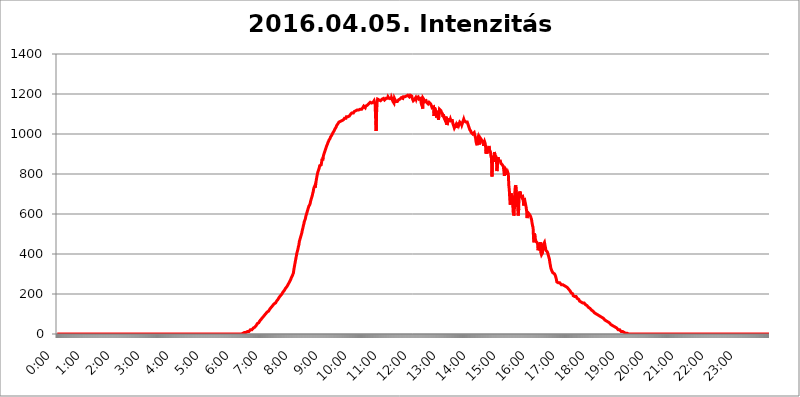
| Category | 2016.04.05. Intenzitás [W/m^2] |
|---|---|
| 0.0 | 0 |
| 0.0006944444444444445 | 0 |
| 0.001388888888888889 | 0 |
| 0.0020833333333333333 | 0 |
| 0.002777777777777778 | 0 |
| 0.003472222222222222 | 0 |
| 0.004166666666666667 | 0 |
| 0.004861111111111111 | 0 |
| 0.005555555555555556 | 0 |
| 0.0062499999999999995 | 0 |
| 0.006944444444444444 | 0 |
| 0.007638888888888889 | 0 |
| 0.008333333333333333 | 0 |
| 0.009027777777777779 | 0 |
| 0.009722222222222222 | 0 |
| 0.010416666666666666 | 0 |
| 0.011111111111111112 | 0 |
| 0.011805555555555555 | 0 |
| 0.012499999999999999 | 0 |
| 0.013194444444444444 | 0 |
| 0.013888888888888888 | 0 |
| 0.014583333333333332 | 0 |
| 0.015277777777777777 | 0 |
| 0.015972222222222224 | 0 |
| 0.016666666666666666 | 0 |
| 0.017361111111111112 | 0 |
| 0.018055555555555557 | 0 |
| 0.01875 | 0 |
| 0.019444444444444445 | 0 |
| 0.02013888888888889 | 0 |
| 0.020833333333333332 | 0 |
| 0.02152777777777778 | 0 |
| 0.022222222222222223 | 0 |
| 0.02291666666666667 | 0 |
| 0.02361111111111111 | 0 |
| 0.024305555555555556 | 0 |
| 0.024999999999999998 | 0 |
| 0.025694444444444447 | 0 |
| 0.02638888888888889 | 0 |
| 0.027083333333333334 | 0 |
| 0.027777777777777776 | 0 |
| 0.02847222222222222 | 0 |
| 0.029166666666666664 | 0 |
| 0.029861111111111113 | 0 |
| 0.030555555555555555 | 0 |
| 0.03125 | 0 |
| 0.03194444444444445 | 0 |
| 0.03263888888888889 | 0 |
| 0.03333333333333333 | 0 |
| 0.034027777777777775 | 0 |
| 0.034722222222222224 | 0 |
| 0.035416666666666666 | 0 |
| 0.036111111111111115 | 0 |
| 0.03680555555555556 | 0 |
| 0.0375 | 0 |
| 0.03819444444444444 | 0 |
| 0.03888888888888889 | 0 |
| 0.03958333333333333 | 0 |
| 0.04027777777777778 | 0 |
| 0.04097222222222222 | 0 |
| 0.041666666666666664 | 0 |
| 0.042361111111111106 | 0 |
| 0.04305555555555556 | 0 |
| 0.043750000000000004 | 0 |
| 0.044444444444444446 | 0 |
| 0.04513888888888889 | 0 |
| 0.04583333333333334 | 0 |
| 0.04652777777777778 | 0 |
| 0.04722222222222222 | 0 |
| 0.04791666666666666 | 0 |
| 0.04861111111111111 | 0 |
| 0.049305555555555554 | 0 |
| 0.049999999999999996 | 0 |
| 0.05069444444444445 | 0 |
| 0.051388888888888894 | 0 |
| 0.052083333333333336 | 0 |
| 0.05277777777777778 | 0 |
| 0.05347222222222222 | 0 |
| 0.05416666666666667 | 0 |
| 0.05486111111111111 | 0 |
| 0.05555555555555555 | 0 |
| 0.05625 | 0 |
| 0.05694444444444444 | 0 |
| 0.057638888888888885 | 0 |
| 0.05833333333333333 | 0 |
| 0.05902777777777778 | 0 |
| 0.059722222222222225 | 0 |
| 0.06041666666666667 | 0 |
| 0.061111111111111116 | 0 |
| 0.06180555555555556 | 0 |
| 0.0625 | 0 |
| 0.06319444444444444 | 0 |
| 0.06388888888888888 | 0 |
| 0.06458333333333334 | 0 |
| 0.06527777777777778 | 0 |
| 0.06597222222222222 | 0 |
| 0.06666666666666667 | 0 |
| 0.06736111111111111 | 0 |
| 0.06805555555555555 | 0 |
| 0.06874999999999999 | 0 |
| 0.06944444444444443 | 0 |
| 0.07013888888888889 | 0 |
| 0.07083333333333333 | 0 |
| 0.07152777777777779 | 0 |
| 0.07222222222222223 | 0 |
| 0.07291666666666667 | 0 |
| 0.07361111111111111 | 0 |
| 0.07430555555555556 | 0 |
| 0.075 | 0 |
| 0.07569444444444444 | 0 |
| 0.0763888888888889 | 0 |
| 0.07708333333333334 | 0 |
| 0.07777777777777778 | 0 |
| 0.07847222222222222 | 0 |
| 0.07916666666666666 | 0 |
| 0.0798611111111111 | 0 |
| 0.08055555555555556 | 0 |
| 0.08125 | 0 |
| 0.08194444444444444 | 0 |
| 0.08263888888888889 | 0 |
| 0.08333333333333333 | 0 |
| 0.08402777777777777 | 0 |
| 0.08472222222222221 | 0 |
| 0.08541666666666665 | 0 |
| 0.08611111111111112 | 0 |
| 0.08680555555555557 | 0 |
| 0.08750000000000001 | 0 |
| 0.08819444444444445 | 0 |
| 0.08888888888888889 | 0 |
| 0.08958333333333333 | 0 |
| 0.09027777777777778 | 0 |
| 0.09097222222222222 | 0 |
| 0.09166666666666667 | 0 |
| 0.09236111111111112 | 0 |
| 0.09305555555555556 | 0 |
| 0.09375 | 0 |
| 0.09444444444444444 | 0 |
| 0.09513888888888888 | 0 |
| 0.09583333333333333 | 0 |
| 0.09652777777777777 | 0 |
| 0.09722222222222222 | 0 |
| 0.09791666666666667 | 0 |
| 0.09861111111111111 | 0 |
| 0.09930555555555555 | 0 |
| 0.09999999999999999 | 0 |
| 0.10069444444444443 | 0 |
| 0.1013888888888889 | 0 |
| 0.10208333333333335 | 0 |
| 0.10277777777777779 | 0 |
| 0.10347222222222223 | 0 |
| 0.10416666666666667 | 0 |
| 0.10486111111111111 | 0 |
| 0.10555555555555556 | 0 |
| 0.10625 | 0 |
| 0.10694444444444444 | 0 |
| 0.1076388888888889 | 0 |
| 0.10833333333333334 | 0 |
| 0.10902777777777778 | 0 |
| 0.10972222222222222 | 0 |
| 0.1111111111111111 | 0 |
| 0.11180555555555556 | 0 |
| 0.11180555555555556 | 0 |
| 0.1125 | 0 |
| 0.11319444444444444 | 0 |
| 0.11388888888888889 | 0 |
| 0.11458333333333333 | 0 |
| 0.11527777777777777 | 0 |
| 0.11597222222222221 | 0 |
| 0.11666666666666665 | 0 |
| 0.1173611111111111 | 0 |
| 0.11805555555555557 | 0 |
| 0.11944444444444445 | 0 |
| 0.12013888888888889 | 0 |
| 0.12083333333333333 | 0 |
| 0.12152777777777778 | 0 |
| 0.12222222222222223 | 0 |
| 0.12291666666666667 | 0 |
| 0.12291666666666667 | 0 |
| 0.12361111111111112 | 0 |
| 0.12430555555555556 | 0 |
| 0.125 | 0 |
| 0.12569444444444444 | 0 |
| 0.12638888888888888 | 0 |
| 0.12708333333333333 | 0 |
| 0.16875 | 0 |
| 0.12847222222222224 | 0 |
| 0.12916666666666668 | 0 |
| 0.12986111111111112 | 0 |
| 0.13055555555555556 | 0 |
| 0.13125 | 0 |
| 0.13194444444444445 | 0 |
| 0.1326388888888889 | 0 |
| 0.13333333333333333 | 0 |
| 0.13402777777777777 | 0 |
| 0.13402777777777777 | 0 |
| 0.13472222222222222 | 0 |
| 0.13541666666666666 | 0 |
| 0.1361111111111111 | 0 |
| 0.13749999999999998 | 0 |
| 0.13819444444444443 | 0 |
| 0.1388888888888889 | 0 |
| 0.13958333333333334 | 0 |
| 0.14027777777777778 | 0 |
| 0.14097222222222222 | 0 |
| 0.14166666666666666 | 0 |
| 0.1423611111111111 | 0 |
| 0.14305555555555557 | 0 |
| 0.14375000000000002 | 0 |
| 0.14444444444444446 | 0 |
| 0.1451388888888889 | 0 |
| 0.1451388888888889 | 0 |
| 0.14652777777777778 | 0 |
| 0.14722222222222223 | 0 |
| 0.14791666666666667 | 0 |
| 0.1486111111111111 | 0 |
| 0.14930555555555555 | 0 |
| 0.15 | 0 |
| 0.15069444444444444 | 0 |
| 0.15138888888888888 | 0 |
| 0.15208333333333332 | 0 |
| 0.15277777777777776 | 0 |
| 0.15347222222222223 | 0 |
| 0.15416666666666667 | 0 |
| 0.15486111111111112 | 0 |
| 0.15555555555555556 | 0 |
| 0.15625 | 0 |
| 0.15694444444444444 | 0 |
| 0.15763888888888888 | 0 |
| 0.15833333333333333 | 0 |
| 0.15902777777777777 | 0 |
| 0.15972222222222224 | 0 |
| 0.16041666666666668 | 0 |
| 0.16111111111111112 | 0 |
| 0.16180555555555556 | 0 |
| 0.1625 | 0 |
| 0.16319444444444445 | 0 |
| 0.1638888888888889 | 0 |
| 0.16458333333333333 | 0 |
| 0.16527777777777777 | 0 |
| 0.16597222222222222 | 0 |
| 0.16666666666666666 | 0 |
| 0.1673611111111111 | 0 |
| 0.16805555555555554 | 0 |
| 0.16874999999999998 | 0 |
| 0.16944444444444443 | 0 |
| 0.17013888888888887 | 0 |
| 0.1708333333333333 | 0 |
| 0.17152777777777775 | 0 |
| 0.17222222222222225 | 0 |
| 0.1729166666666667 | 0 |
| 0.17361111111111113 | 0 |
| 0.17430555555555557 | 0 |
| 0.17500000000000002 | 0 |
| 0.17569444444444446 | 0 |
| 0.1763888888888889 | 0 |
| 0.17708333333333334 | 0 |
| 0.17777777777777778 | 0 |
| 0.17847222222222223 | 0 |
| 0.17916666666666667 | 0 |
| 0.1798611111111111 | 0 |
| 0.18055555555555555 | 0 |
| 0.18125 | 0 |
| 0.18194444444444444 | 0 |
| 0.1826388888888889 | 0 |
| 0.18333333333333335 | 0 |
| 0.1840277777777778 | 0 |
| 0.18472222222222223 | 0 |
| 0.18541666666666667 | 0 |
| 0.18611111111111112 | 0 |
| 0.18680555555555556 | 0 |
| 0.1875 | 0 |
| 0.18819444444444444 | 0 |
| 0.18888888888888888 | 0 |
| 0.18958333333333333 | 0 |
| 0.19027777777777777 | 0 |
| 0.1909722222222222 | 0 |
| 0.19166666666666665 | 0 |
| 0.19236111111111112 | 0 |
| 0.19305555555555554 | 0 |
| 0.19375 | 0 |
| 0.19444444444444445 | 0 |
| 0.1951388888888889 | 0 |
| 0.19583333333333333 | 0 |
| 0.19652777777777777 | 0 |
| 0.19722222222222222 | 0 |
| 0.19791666666666666 | 0 |
| 0.1986111111111111 | 0 |
| 0.19930555555555554 | 0 |
| 0.19999999999999998 | 0 |
| 0.20069444444444443 | 0 |
| 0.20138888888888887 | 0 |
| 0.2020833333333333 | 0 |
| 0.2027777777777778 | 0 |
| 0.2034722222222222 | 0 |
| 0.2041666666666667 | 0 |
| 0.20486111111111113 | 0 |
| 0.20555555555555557 | 0 |
| 0.20625000000000002 | 0 |
| 0.20694444444444446 | 0 |
| 0.2076388888888889 | 0 |
| 0.20833333333333334 | 0 |
| 0.20902777777777778 | 0 |
| 0.20972222222222223 | 0 |
| 0.21041666666666667 | 0 |
| 0.2111111111111111 | 0 |
| 0.21180555555555555 | 0 |
| 0.2125 | 0 |
| 0.21319444444444444 | 0 |
| 0.2138888888888889 | 0 |
| 0.21458333333333335 | 0 |
| 0.2152777777777778 | 0 |
| 0.21597222222222223 | 0 |
| 0.21666666666666667 | 0 |
| 0.21736111111111112 | 0 |
| 0.21805555555555556 | 0 |
| 0.21875 | 0 |
| 0.21944444444444444 | 0 |
| 0.22013888888888888 | 0 |
| 0.22083333333333333 | 0 |
| 0.22152777777777777 | 0 |
| 0.2222222222222222 | 0 |
| 0.22291666666666665 | 0 |
| 0.2236111111111111 | 0 |
| 0.22430555555555556 | 0 |
| 0.225 | 0 |
| 0.22569444444444445 | 0 |
| 0.2263888888888889 | 0 |
| 0.22708333333333333 | 0 |
| 0.22777777777777777 | 0 |
| 0.22847222222222222 | 0 |
| 0.22916666666666666 | 0 |
| 0.2298611111111111 | 0 |
| 0.23055555555555554 | 0 |
| 0.23124999999999998 | 0 |
| 0.23194444444444443 | 0 |
| 0.23263888888888887 | 0 |
| 0.2333333333333333 | 0 |
| 0.2340277777777778 | 0 |
| 0.2347222222222222 | 0 |
| 0.2354166666666667 | 0 |
| 0.23611111111111113 | 0 |
| 0.23680555555555557 | 0 |
| 0.23750000000000002 | 0 |
| 0.23819444444444446 | 0 |
| 0.2388888888888889 | 0 |
| 0.23958333333333334 | 0 |
| 0.24027777777777778 | 0 |
| 0.24097222222222223 | 0 |
| 0.24166666666666667 | 0 |
| 0.2423611111111111 | 0 |
| 0.24305555555555555 | 0 |
| 0.24375 | 0 |
| 0.24444444444444446 | 0 |
| 0.24513888888888888 | 0 |
| 0.24583333333333335 | 0 |
| 0.2465277777777778 | 0 |
| 0.24722222222222223 | 0 |
| 0.24791666666666667 | 0 |
| 0.24861111111111112 | 0 |
| 0.24930555555555556 | 0 |
| 0.25 | 0 |
| 0.25069444444444444 | 0 |
| 0.2513888888888889 | 0 |
| 0.2520833333333333 | 0 |
| 0.25277777777777777 | 0 |
| 0.2534722222222222 | 0 |
| 0.25416666666666665 | 0 |
| 0.2548611111111111 | 0 |
| 0.2555555555555556 | 0 |
| 0.25625000000000003 | 0 |
| 0.2569444444444445 | 0 |
| 0.2576388888888889 | 0 |
| 0.25833333333333336 | 0 |
| 0.2590277777777778 | 3.525 |
| 0.25972222222222224 | 3.525 |
| 0.2604166666666667 | 3.525 |
| 0.2611111111111111 | 3.525 |
| 0.26180555555555557 | 3.525 |
| 0.2625 | 7.887 |
| 0.26319444444444445 | 7.887 |
| 0.2638888888888889 | 7.887 |
| 0.26458333333333334 | 7.887 |
| 0.2652777777777778 | 7.887 |
| 0.2659722222222222 | 12.257 |
| 0.26666666666666666 | 12.257 |
| 0.2673611111111111 | 12.257 |
| 0.26805555555555555 | 12.257 |
| 0.26875 | 12.257 |
| 0.26944444444444443 | 16.636 |
| 0.2701388888888889 | 16.636 |
| 0.2708333333333333 | 21.024 |
| 0.27152777777777776 | 21.024 |
| 0.2722222222222222 | 21.024 |
| 0.27291666666666664 | 21.024 |
| 0.2736111111111111 | 25.419 |
| 0.2743055555555555 | 25.419 |
| 0.27499999999999997 | 29.823 |
| 0.27569444444444446 | 29.823 |
| 0.27638888888888885 | 34.234 |
| 0.27708333333333335 | 34.234 |
| 0.2777777777777778 | 38.653 |
| 0.27847222222222223 | 38.653 |
| 0.2791666666666667 | 43.079 |
| 0.2798611111111111 | 47.511 |
| 0.28055555555555556 | 51.951 |
| 0.28125 | 56.398 |
| 0.28194444444444444 | 56.398 |
| 0.2826388888888889 | 56.398 |
| 0.2833333333333333 | 60.85 |
| 0.28402777777777777 | 65.31 |
| 0.2847222222222222 | 65.31 |
| 0.28541666666666665 | 69.775 |
| 0.28611111111111115 | 74.246 |
| 0.28680555555555554 | 74.246 |
| 0.28750000000000003 | 78.722 |
| 0.2881944444444445 | 83.205 |
| 0.2888888888888889 | 83.205 |
| 0.28958333333333336 | 87.692 |
| 0.2902777777777778 | 92.184 |
| 0.29097222222222224 | 92.184 |
| 0.2916666666666667 | 96.682 |
| 0.2923611111111111 | 101.184 |
| 0.29305555555555557 | 101.184 |
| 0.29375 | 105.69 |
| 0.29444444444444445 | 110.201 |
| 0.2951388888888889 | 110.201 |
| 0.29583333333333334 | 114.716 |
| 0.2965277777777778 | 114.716 |
| 0.2972222222222222 | 119.235 |
| 0.29791666666666666 | 123.758 |
| 0.2986111111111111 | 128.284 |
| 0.29930555555555555 | 128.284 |
| 0.3 | 132.814 |
| 0.30069444444444443 | 137.347 |
| 0.3013888888888889 | 137.347 |
| 0.3020833333333333 | 141.884 |
| 0.30277777777777776 | 141.884 |
| 0.3034722222222222 | 146.423 |
| 0.30416666666666664 | 150.964 |
| 0.3048611111111111 | 155.509 |
| 0.3055555555555555 | 155.509 |
| 0.30624999999999997 | 155.509 |
| 0.3069444444444444 | 160.056 |
| 0.3076388888888889 | 164.605 |
| 0.30833333333333335 | 164.605 |
| 0.3090277777777778 | 169.156 |
| 0.30972222222222223 | 173.709 |
| 0.3104166666666667 | 178.264 |
| 0.3111111111111111 | 182.82 |
| 0.31180555555555556 | 182.82 |
| 0.3125 | 187.378 |
| 0.31319444444444444 | 191.937 |
| 0.3138888888888889 | 196.497 |
| 0.3145833333333333 | 196.497 |
| 0.31527777777777777 | 201.058 |
| 0.3159722222222222 | 205.62 |
| 0.31666666666666665 | 210.182 |
| 0.31736111111111115 | 210.182 |
| 0.31805555555555554 | 214.746 |
| 0.31875000000000003 | 219.309 |
| 0.3194444444444445 | 223.873 |
| 0.3201388888888889 | 228.436 |
| 0.32083333333333336 | 233 |
| 0.3215277777777778 | 233 |
| 0.32222222222222224 | 237.564 |
| 0.3229166666666667 | 242.127 |
| 0.3236111111111111 | 246.689 |
| 0.32430555555555557 | 251.251 |
| 0.325 | 251.251 |
| 0.32569444444444445 | 260.373 |
| 0.3263888888888889 | 260.373 |
| 0.32708333333333334 | 269.49 |
| 0.3277777777777778 | 274.047 |
| 0.3284722222222222 | 283.156 |
| 0.32916666666666666 | 287.709 |
| 0.3298611111111111 | 292.259 |
| 0.33055555555555555 | 296.808 |
| 0.33125 | 305.898 |
| 0.33194444444444443 | 324.052 |
| 0.3326388888888889 | 337.639 |
| 0.3333333333333333 | 351.198 |
| 0.3340277777777778 | 364.728 |
| 0.3347222222222222 | 378.224 |
| 0.3354166666666667 | 391.685 |
| 0.3361111111111111 | 405.108 |
| 0.3368055555555556 | 414.035 |
| 0.33749999999999997 | 422.943 |
| 0.33819444444444446 | 436.27 |
| 0.33888888888888885 | 445.129 |
| 0.33958333333333335 | 462.786 |
| 0.34027777777777773 | 471.582 |
| 0.34097222222222223 | 480.356 |
| 0.3416666666666666 | 489.108 |
| 0.3423611111111111 | 497.836 |
| 0.3430555555555555 | 506.542 |
| 0.34375 | 519.555 |
| 0.3444444444444445 | 528.2 |
| 0.3451388888888889 | 541.121 |
| 0.3458333333333334 | 549.704 |
| 0.34652777777777777 | 562.53 |
| 0.34722222222222227 | 566.793 |
| 0.34791666666666665 | 575.299 |
| 0.34861111111111115 | 588.009 |
| 0.34930555555555554 | 596.45 |
| 0.35000000000000003 | 604.864 |
| 0.3506944444444444 | 613.252 |
| 0.3513888888888889 | 621.613 |
| 0.3520833333333333 | 629.948 |
| 0.3527777777777778 | 638.256 |
| 0.3534722222222222 | 638.256 |
| 0.3541666666666667 | 646.537 |
| 0.3548611111111111 | 654.791 |
| 0.35555555555555557 | 667.123 |
| 0.35625 | 675.311 |
| 0.35694444444444445 | 683.473 |
| 0.3576388888888889 | 691.608 |
| 0.35833333333333334 | 703.762 |
| 0.3590277777777778 | 711.832 |
| 0.3597222222222222 | 727.896 |
| 0.36041666666666666 | 731.896 |
| 0.3611111111111111 | 739.877 |
| 0.36180555555555555 | 731.896 |
| 0.3625 | 747.834 |
| 0.36319444444444443 | 767.62 |
| 0.3638888888888889 | 767.62 |
| 0.3645833333333333 | 795.074 |
| 0.3652777777777778 | 806.757 |
| 0.3659722222222222 | 814.519 |
| 0.3666666666666667 | 822.26 |
| 0.3673611111111111 | 829.981 |
| 0.3680555555555556 | 841.526 |
| 0.36874999999999997 | 837.682 |
| 0.36944444444444446 | 841.526 |
| 0.37013888888888885 | 845.365 |
| 0.37083333333333335 | 860.676 |
| 0.37152777777777773 | 875.918 |
| 0.37222222222222223 | 868.305 |
| 0.3729166666666666 | 883.516 |
| 0.3736111111111111 | 894.885 |
| 0.3743055555555555 | 902.447 |
| 0.375 | 909.996 |
| 0.3756944444444445 | 917.534 |
| 0.3763888888888889 | 925.06 |
| 0.3770833333333334 | 932.576 |
| 0.37777777777777777 | 940.082 |
| 0.37847222222222227 | 943.832 |
| 0.37916666666666665 | 951.327 |
| 0.37986111111111115 | 958.814 |
| 0.38055555555555554 | 962.555 |
| 0.38125000000000003 | 970.034 |
| 0.3819444444444444 | 973.772 |
| 0.3826388888888889 | 977.508 |
| 0.3833333333333333 | 984.98 |
| 0.3840277777777778 | 988.714 |
| 0.3847222222222222 | 992.448 |
| 0.3854166666666667 | 996.182 |
| 0.3861111111111111 | 996.182 |
| 0.38680555555555557 | 1007.383 |
| 0.3875 | 1007.383 |
| 0.38819444444444445 | 1014.852 |
| 0.3888888888888889 | 1018.587 |
| 0.38958333333333334 | 1026.06 |
| 0.3902777777777778 | 1029.798 |
| 0.3909722222222222 | 1033.537 |
| 0.39166666666666666 | 1041.019 |
| 0.3923611111111111 | 1041.019 |
| 0.39305555555555555 | 1041.019 |
| 0.39375 | 1052.255 |
| 0.39444444444444443 | 1056.004 |
| 0.3951388888888889 | 1059.756 |
| 0.3958333333333333 | 1059.756 |
| 0.3965277777777778 | 1063.51 |
| 0.3972222222222222 | 1063.51 |
| 0.3979166666666667 | 1063.51 |
| 0.3986111111111111 | 1067.267 |
| 0.3993055555555556 | 1067.267 |
| 0.39999999999999997 | 1067.267 |
| 0.40069444444444446 | 1071.027 |
| 0.40138888888888885 | 1071.027 |
| 0.40208333333333335 | 1074.789 |
| 0.40277777777777773 | 1078.555 |
| 0.40347222222222223 | 1078.555 |
| 0.4041666666666666 | 1078.555 |
| 0.4048611111111111 | 1078.555 |
| 0.4055555555555555 | 1086.097 |
| 0.40625 | 1086.097 |
| 0.4069444444444445 | 1086.097 |
| 0.4076388888888889 | 1086.097 |
| 0.4083333333333334 | 1089.873 |
| 0.40902777777777777 | 1089.873 |
| 0.40972222222222227 | 1089.873 |
| 0.41041666666666665 | 1093.653 |
| 0.41111111111111115 | 1097.437 |
| 0.41180555555555554 | 1101.226 |
| 0.41250000000000003 | 1101.226 |
| 0.4131944444444444 | 1105.019 |
| 0.4138888888888889 | 1101.226 |
| 0.4145833333333333 | 1105.019 |
| 0.4152777777777778 | 1105.019 |
| 0.4159722222222222 | 1108.816 |
| 0.4166666666666667 | 1112.618 |
| 0.4173611111111111 | 1112.618 |
| 0.41805555555555557 | 1116.426 |
| 0.41875 | 1116.426 |
| 0.41944444444444445 | 1120.238 |
| 0.4201388888888889 | 1120.238 |
| 0.42083333333333334 | 1120.238 |
| 0.4215277777777778 | 1120.238 |
| 0.4222222222222222 | 1120.238 |
| 0.42291666666666666 | 1120.238 |
| 0.4236111111111111 | 1120.238 |
| 0.42430555555555555 | 1124.056 |
| 0.425 | 1124.056 |
| 0.42569444444444443 | 1124.056 |
| 0.4263888888888889 | 1120.238 |
| 0.4270833333333333 | 1124.056 |
| 0.4277777777777778 | 1127.879 |
| 0.4284722222222222 | 1131.708 |
| 0.4291666666666667 | 1131.708 |
| 0.4298611111111111 | 1139.384 |
| 0.4305555555555556 | 1139.384 |
| 0.43124999999999997 | 1143.232 |
| 0.43194444444444446 | 1131.708 |
| 0.43263888888888885 | 1139.384 |
| 0.43333333333333335 | 1135.543 |
| 0.43402777777777773 | 1139.384 |
| 0.43472222222222223 | 1143.232 |
| 0.4354166666666666 | 1143.232 |
| 0.4361111111111111 | 1143.232 |
| 0.4368055555555555 | 1150.946 |
| 0.4375 | 1150.946 |
| 0.4381944444444445 | 1150.946 |
| 0.4388888888888889 | 1158.689 |
| 0.4395833333333334 | 1154.814 |
| 0.44027777777777777 | 1158.689 |
| 0.44097222222222227 | 1154.814 |
| 0.44166666666666665 | 1154.814 |
| 0.44236111111111115 | 1154.814 |
| 0.44305555555555554 | 1158.689 |
| 0.44375000000000003 | 1162.571 |
| 0.4444444444444444 | 1166.46 |
| 0.4451388888888889 | 1162.571 |
| 0.4458333333333333 | 1147.086 |
| 0.4465277777777778 | 1078.555 |
| 0.4472222222222222 | 1014.852 |
| 0.4479166666666667 | 1108.816 |
| 0.4486111111111111 | 1158.689 |
| 0.44930555555555557 | 1174.263 |
| 0.45 | 1170.358 |
| 0.45069444444444445 | 1170.358 |
| 0.4513888888888889 | 1170.358 |
| 0.45208333333333334 | 1166.46 |
| 0.4527777777777778 | 1166.46 |
| 0.4534722222222222 | 1166.46 |
| 0.45416666666666666 | 1170.358 |
| 0.4548611111111111 | 1170.358 |
| 0.45555555555555555 | 1174.263 |
| 0.45625 | 1174.263 |
| 0.45694444444444443 | 1174.263 |
| 0.4576388888888889 | 1178.177 |
| 0.4583333333333333 | 1174.263 |
| 0.4590277777777778 | 1170.358 |
| 0.4597222222222222 | 1174.263 |
| 0.4604166666666667 | 1166.46 |
| 0.4611111111111111 | 1178.177 |
| 0.4618055555555556 | 1178.177 |
| 0.46249999999999997 | 1182.099 |
| 0.46319444444444446 | 1178.177 |
| 0.46388888888888885 | 1186.03 |
| 0.46458333333333335 | 1182.099 |
| 0.46527777777777773 | 1178.177 |
| 0.46597222222222223 | 1178.177 |
| 0.4666666666666666 | 1178.177 |
| 0.4673611111111111 | 1178.177 |
| 0.4680555555555555 | 1170.358 |
| 0.46875 | 1182.099 |
| 0.4694444444444445 | 1186.03 |
| 0.4701388888888889 | 1182.099 |
| 0.4708333333333334 | 1162.571 |
| 0.47152777777777777 | 1158.689 |
| 0.47222222222222227 | 1154.814 |
| 0.47291666666666665 | 1178.177 |
| 0.47361111111111115 | 1178.177 |
| 0.47430555555555554 | 1174.263 |
| 0.47500000000000003 | 1162.571 |
| 0.4756944444444444 | 1158.689 |
| 0.4763888888888889 | 1162.571 |
| 0.4770833333333333 | 1162.571 |
| 0.4777777777777778 | 1166.46 |
| 0.4784722222222222 | 1170.358 |
| 0.4791666666666667 | 1174.263 |
| 0.4798611111111111 | 1174.263 |
| 0.48055555555555557 | 1174.263 |
| 0.48125 | 1170.358 |
| 0.48194444444444445 | 1174.263 |
| 0.4826388888888889 | 1182.099 |
| 0.48333333333333334 | 1178.177 |
| 0.4840277777777778 | 1178.177 |
| 0.4847222222222222 | 1178.177 |
| 0.48541666666666666 | 1186.03 |
| 0.4861111111111111 | 1189.969 |
| 0.48680555555555555 | 1186.03 |
| 0.4875 | 1186.03 |
| 0.48819444444444443 | 1186.03 |
| 0.4888888888888889 | 1186.03 |
| 0.4895833333333333 | 1189.969 |
| 0.4902777777777778 | 1193.918 |
| 0.4909722222222222 | 1189.969 |
| 0.4916666666666667 | 1193.918 |
| 0.4923611111111111 | 1193.918 |
| 0.4930555555555556 | 1189.969 |
| 0.49374999999999997 | 1186.03 |
| 0.49444444444444446 | 1189.969 |
| 0.49513888888888885 | 1193.918 |
| 0.49583333333333335 | 1189.969 |
| 0.49652777777777773 | 1189.969 |
| 0.49722222222222223 | 1189.969 |
| 0.4979166666666666 | 1178.177 |
| 0.4986111111111111 | 1178.177 |
| 0.4993055555555555 | 1166.46 |
| 0.5 | 1166.46 |
| 0.5006944444444444 | 1170.358 |
| 0.5013888888888889 | 1174.263 |
| 0.5020833333333333 | 1178.177 |
| 0.5027777777777778 | 1182.099 |
| 0.5034722222222222 | 1174.263 |
| 0.5041666666666667 | 1182.099 |
| 0.5048611111111111 | 1178.177 |
| 0.5055555555555555 | 1182.099 |
| 0.50625 | 1186.03 |
| 0.5069444444444444 | 1182.099 |
| 0.5076388888888889 | 1174.263 |
| 0.5083333333333333 | 1170.358 |
| 0.5090277777777777 | 1174.263 |
| 0.5097222222222222 | 1178.177 |
| 0.5104166666666666 | 1154.814 |
| 0.5111111111111112 | 1147.086 |
| 0.5118055555555555 | 1154.814 |
| 0.5125000000000001 | 1127.879 |
| 0.5131944444444444 | 1178.177 |
| 0.513888888888889 | 1174.263 |
| 0.5145833333333333 | 1170.358 |
| 0.5152777777777778 | 1162.571 |
| 0.5159722222222222 | 1162.571 |
| 0.5166666666666667 | 1166.46 |
| 0.517361111111111 | 1166.46 |
| 0.5180555555555556 | 1158.689 |
| 0.5187499999999999 | 1158.689 |
| 0.5194444444444445 | 1162.571 |
| 0.5201388888888888 | 1150.946 |
| 0.5208333333333334 | 1154.814 |
| 0.5215277777777778 | 1158.689 |
| 0.5222222222222223 | 1158.689 |
| 0.5229166666666667 | 1158.689 |
| 0.5236111111111111 | 1150.946 |
| 0.5243055555555556 | 1147.086 |
| 0.525 | 1139.384 |
| 0.5256944444444445 | 1131.708 |
| 0.5263888888888889 | 1131.708 |
| 0.5270833333333333 | 1127.879 |
| 0.5277777777777778 | 1135.543 |
| 0.5284722222222222 | 1089.873 |
| 0.5291666666666667 | 1131.708 |
| 0.5298611111111111 | 1135.543 |
| 0.5305555555555556 | 1120.238 |
| 0.53125 | 1105.019 |
| 0.5319444444444444 | 1082.324 |
| 0.5326388888888889 | 1105.019 |
| 0.5333333333333333 | 1116.426 |
| 0.5340277777777778 | 1089.873 |
| 0.5347222222222222 | 1071.027 |
| 0.5354166666666667 | 1101.226 |
| 0.5361111111111111 | 1124.056 |
| 0.5368055555555555 | 1124.056 |
| 0.5375 | 1120.238 |
| 0.5381944444444444 | 1116.426 |
| 0.5388888888888889 | 1108.816 |
| 0.5395833333333333 | 1105.019 |
| 0.5402777777777777 | 1101.226 |
| 0.5409722222222222 | 1086.097 |
| 0.5416666666666666 | 1097.437 |
| 0.5423611111111112 | 1082.324 |
| 0.5430555555555555 | 1082.324 |
| 0.5437500000000001 | 1071.027 |
| 0.5444444444444444 | 1086.097 |
| 0.545138888888889 | 1063.51 |
| 0.5458333333333333 | 1086.097 |
| 0.5465277777777778 | 1044.762 |
| 0.5472222222222222 | 1044.762 |
| 0.5479166666666667 | 1044.762 |
| 0.548611111111111 | 1071.027 |
| 0.5493055555555556 | 1078.555 |
| 0.5499999999999999 | 1059.756 |
| 0.5506944444444445 | 1056.004 |
| 0.5513888888888888 | 1074.789 |
| 0.5520833333333334 | 1067.267 |
| 0.5527777777777778 | 1067.267 |
| 0.5534722222222223 | 1067.267 |
| 0.5541666666666667 | 1067.267 |
| 0.5548611111111111 | 1052.255 |
| 0.5555555555555556 | 1044.762 |
| 0.55625 | 1037.277 |
| 0.5569444444444445 | 1029.798 |
| 0.5576388888888889 | 1029.798 |
| 0.5583333333333333 | 1029.798 |
| 0.5590277777777778 | 1044.762 |
| 0.5597222222222222 | 1029.798 |
| 0.5604166666666667 | 1048.508 |
| 0.5611111111111111 | 1052.255 |
| 0.5618055555555556 | 1052.255 |
| 0.5625 | 1052.255 |
| 0.5631944444444444 | 1044.762 |
| 0.5638888888888889 | 1052.255 |
| 0.5645833333333333 | 1059.756 |
| 0.5652777777777778 | 1059.756 |
| 0.5659722222222222 | 1063.51 |
| 0.5666666666666667 | 1052.255 |
| 0.5673611111111111 | 1044.762 |
| 0.5680555555555555 | 1052.255 |
| 0.56875 | 1059.756 |
| 0.5694444444444444 | 1063.51 |
| 0.5701388888888889 | 1074.789 |
| 0.5708333333333333 | 1067.267 |
| 0.5715277777777777 | 1067.267 |
| 0.5722222222222222 | 1067.267 |
| 0.5729166666666666 | 1059.756 |
| 0.5736111111111112 | 1059.756 |
| 0.5743055555555555 | 1056.004 |
| 0.5750000000000001 | 1059.756 |
| 0.5756944444444444 | 1052.255 |
| 0.576388888888889 | 1044.762 |
| 0.5770833333333333 | 1037.277 |
| 0.5777777777777778 | 1029.798 |
| 0.5784722222222222 | 1022.323 |
| 0.5791666666666667 | 1018.587 |
| 0.579861111111111 | 1014.852 |
| 0.5805555555555556 | 1007.383 |
| 0.5812499999999999 | 1007.383 |
| 0.5819444444444445 | 1003.65 |
| 0.5826388888888888 | 999.916 |
| 0.5833333333333334 | 1003.65 |
| 0.5840277777777778 | 1003.65 |
| 0.5847222222222223 | 1007.383 |
| 0.5854166666666667 | 996.182 |
| 0.5861111111111111 | 988.714 |
| 0.5868055555555556 | 977.508 |
| 0.5875 | 958.814 |
| 0.5881944444444445 | 955.071 |
| 0.5888888888888889 | 943.832 |
| 0.5895833333333333 | 977.508 |
| 0.5902777777777778 | 984.98 |
| 0.5909722222222222 | 973.772 |
| 0.5916666666666667 | 973.772 |
| 0.5923611111111111 | 947.58 |
| 0.5930555555555556 | 981.244 |
| 0.59375 | 977.508 |
| 0.5944444444444444 | 977.508 |
| 0.5951388888888889 | 970.034 |
| 0.5958333333333333 | 966.295 |
| 0.5965277777777778 | 962.555 |
| 0.5972222222222222 | 970.034 |
| 0.5979166666666667 | 940.082 |
| 0.5986111111111111 | 955.071 |
| 0.5993055555555555 | 962.555 |
| 0.6 | 955.071 |
| 0.6006944444444444 | 940.082 |
| 0.6013888888888889 | 902.447 |
| 0.6020833333333333 | 928.819 |
| 0.6027777777777777 | 902.447 |
| 0.6034722222222222 | 932.576 |
| 0.6041666666666666 | 913.766 |
| 0.6048611111111112 | 932.576 |
| 0.6055555555555555 | 940.082 |
| 0.6062500000000001 | 921.298 |
| 0.6069444444444444 | 917.534 |
| 0.607638888888889 | 909.996 |
| 0.6083333333333333 | 887.309 |
| 0.6090277777777778 | 879.719 |
| 0.6097222222222222 | 787.258 |
| 0.6104166666666667 | 868.305 |
| 0.611111111111111 | 891.099 |
| 0.6118055555555556 | 860.676 |
| 0.6124999999999999 | 883.516 |
| 0.6131944444444445 | 909.996 |
| 0.6138888888888888 | 894.885 |
| 0.6145833333333334 | 894.885 |
| 0.6152777777777778 | 887.309 |
| 0.6159722222222223 | 872.114 |
| 0.6166666666666667 | 814.519 |
| 0.6173611111111111 | 814.519 |
| 0.6180555555555556 | 883.516 |
| 0.61875 | 875.918 |
| 0.6194444444444445 | 864.493 |
| 0.6201388888888889 | 860.676 |
| 0.6208333333333333 | 860.676 |
| 0.6215277777777778 | 864.493 |
| 0.6222222222222222 | 853.029 |
| 0.6229166666666667 | 856.855 |
| 0.6236111111111111 | 853.029 |
| 0.6243055555555556 | 845.365 |
| 0.625 | 841.526 |
| 0.6256944444444444 | 837.682 |
| 0.6263888888888889 | 833.834 |
| 0.6270833333333333 | 791.169 |
| 0.6277777777777778 | 814.519 |
| 0.6284722222222222 | 795.074 |
| 0.6291666666666667 | 822.26 |
| 0.6298611111111111 | 822.26 |
| 0.6305555555555555 | 814.519 |
| 0.63125 | 798.974 |
| 0.6319444444444444 | 806.757 |
| 0.6326388888888889 | 798.974 |
| 0.6333333333333333 | 743.859 |
| 0.6340277777777777 | 719.877 |
| 0.6347222222222222 | 671.22 |
| 0.6354166666666666 | 646.537 |
| 0.6361111111111112 | 687.544 |
| 0.6368055555555555 | 703.762 |
| 0.6375000000000001 | 667.123 |
| 0.6381944444444444 | 658.909 |
| 0.638888888888889 | 691.608 |
| 0.6395833333333333 | 609.062 |
| 0.6402777777777778 | 592.233 |
| 0.6409722222222222 | 600.661 |
| 0.6416666666666667 | 703.762 |
| 0.642361111111111 | 735.89 |
| 0.6430555555555556 | 743.859 |
| 0.6437499999999999 | 711.832 |
| 0.6444444444444445 | 699.717 |
| 0.6451388888888888 | 675.311 |
| 0.6458333333333334 | 625.784 |
| 0.6465277777777778 | 592.233 |
| 0.6472222222222223 | 625.784 |
| 0.6479166666666667 | 711.832 |
| 0.6486111111111111 | 703.762 |
| 0.6493055555555556 | 711.832 |
| 0.65 | 691.608 |
| 0.6506944444444445 | 691.608 |
| 0.6513888888888889 | 683.473 |
| 0.6520833333333333 | 695.666 |
| 0.6527777777777778 | 687.544 |
| 0.6534722222222222 | 675.311 |
| 0.6541666666666667 | 642.4 |
| 0.6548611111111111 | 679.395 |
| 0.6555555555555556 | 671.22 |
| 0.65625 | 658.909 |
| 0.6569444444444444 | 646.537 |
| 0.6576388888888889 | 634.105 |
| 0.6583333333333333 | 613.252 |
| 0.6590277777777778 | 579.542 |
| 0.6597222222222222 | 609.062 |
| 0.6604166666666667 | 613.252 |
| 0.6611111111111111 | 613.252 |
| 0.6618055555555555 | 600.661 |
| 0.6625 | 596.45 |
| 0.6631944444444444 | 596.45 |
| 0.6638888888888889 | 588.009 |
| 0.6645833333333333 | 583.779 |
| 0.6652777777777777 | 571.049 |
| 0.6659722222222222 | 553.986 |
| 0.6666666666666666 | 541.121 |
| 0.6673611111111111 | 532.513 |
| 0.6680555555555556 | 475.972 |
| 0.6687500000000001 | 458.38 |
| 0.6694444444444444 | 502.192 |
| 0.6701388888888888 | 484.735 |
| 0.6708333333333334 | 471.582 |
| 0.6715277777777778 | 462.786 |
| 0.6722222222222222 | 467.187 |
| 0.6729166666666666 | 458.38 |
| 0.6736111111111112 | 453.968 |
| 0.6743055555555556 | 418.492 |
| 0.6749999999999999 | 414.035 |
| 0.6756944444444444 | 414.035 |
| 0.6763888888888889 | 440.702 |
| 0.6770833333333334 | 440.702 |
| 0.6777777777777777 | 458.38 |
| 0.6784722222222223 | 405.108 |
| 0.6791666666666667 | 396.164 |
| 0.6798611111111111 | 400.638 |
| 0.6805555555555555 | 405.108 |
| 0.68125 | 431.833 |
| 0.6819444444444445 | 449.551 |
| 0.6826388888888889 | 445.129 |
| 0.6833333333333332 | 458.38 |
| 0.6840277777777778 | 458.38 |
| 0.6847222222222222 | 458.38 |
| 0.6854166666666667 | 418.492 |
| 0.686111111111111 | 414.035 |
| 0.6868055555555556 | 414.035 |
| 0.6875 | 409.574 |
| 0.6881944444444444 | 405.108 |
| 0.688888888888889 | 391.685 |
| 0.6895833333333333 | 382.715 |
| 0.6902777777777778 | 373.729 |
| 0.6909722222222222 | 355.712 |
| 0.6916666666666668 | 342.162 |
| 0.6923611111111111 | 328.584 |
| 0.6930555555555555 | 324.052 |
| 0.69375 | 314.98 |
| 0.6944444444444445 | 310.44 |
| 0.6951388888888889 | 305.898 |
| 0.6958333333333333 | 305.898 |
| 0.6965277777777777 | 301.354 |
| 0.6972222222222223 | 301.354 |
| 0.6979166666666666 | 296.808 |
| 0.6986111111111111 | 292.259 |
| 0.6993055555555556 | 283.156 |
| 0.7000000000000001 | 274.047 |
| 0.7006944444444444 | 260.373 |
| 0.7013888888888888 | 255.813 |
| 0.7020833333333334 | 255.813 |
| 0.7027777777777778 | 255.813 |
| 0.7034722222222222 | 255.813 |
| 0.7041666666666666 | 260.373 |
| 0.7048611111111112 | 255.813 |
| 0.7055555555555556 | 251.251 |
| 0.7062499999999999 | 251.251 |
| 0.7069444444444444 | 246.689 |
| 0.7076388888888889 | 246.689 |
| 0.7083333333333334 | 246.689 |
| 0.7090277777777777 | 246.689 |
| 0.7097222222222223 | 242.127 |
| 0.7104166666666667 | 242.127 |
| 0.7111111111111111 | 242.127 |
| 0.7118055555555555 | 237.564 |
| 0.7125 | 237.564 |
| 0.7131944444444445 | 237.564 |
| 0.7138888888888889 | 233 |
| 0.7145833333333332 | 233 |
| 0.7152777777777778 | 233 |
| 0.7159722222222222 | 228.436 |
| 0.7166666666666667 | 228.436 |
| 0.717361111111111 | 223.873 |
| 0.7180555555555556 | 223.873 |
| 0.71875 | 219.309 |
| 0.7194444444444444 | 214.746 |
| 0.720138888888889 | 210.182 |
| 0.7208333333333333 | 205.62 |
| 0.7215277777777778 | 205.62 |
| 0.7222222222222222 | 201.058 |
| 0.7229166666666668 | 201.058 |
| 0.7236111111111111 | 191.937 |
| 0.7243055555555555 | 191.937 |
| 0.725 | 191.937 |
| 0.7256944444444445 | 187.378 |
| 0.7263888888888889 | 187.378 |
| 0.7270833333333333 | 187.378 |
| 0.7277777777777777 | 187.378 |
| 0.7284722222222223 | 182.82 |
| 0.7291666666666666 | 178.264 |
| 0.7298611111111111 | 178.264 |
| 0.7305555555555556 | 173.709 |
| 0.7312500000000001 | 173.709 |
| 0.7319444444444444 | 169.156 |
| 0.7326388888888888 | 164.605 |
| 0.7333333333333334 | 164.605 |
| 0.7340277777777778 | 160.056 |
| 0.7347222222222222 | 160.056 |
| 0.7354166666666666 | 160.056 |
| 0.7361111111111112 | 160.056 |
| 0.7368055555555556 | 155.509 |
| 0.7374999999999999 | 155.509 |
| 0.7381944444444444 | 155.509 |
| 0.7388888888888889 | 155.509 |
| 0.7395833333333334 | 150.964 |
| 0.7402777777777777 | 150.964 |
| 0.7409722222222223 | 146.423 |
| 0.7416666666666667 | 146.423 |
| 0.7423611111111111 | 146.423 |
| 0.7430555555555555 | 141.884 |
| 0.74375 | 137.347 |
| 0.7444444444444445 | 137.347 |
| 0.7451388888888889 | 132.814 |
| 0.7458333333333332 | 132.814 |
| 0.7465277777777778 | 132.814 |
| 0.7472222222222222 | 128.284 |
| 0.7479166666666667 | 128.284 |
| 0.748611111111111 | 123.758 |
| 0.7493055555555556 | 119.235 |
| 0.75 | 119.235 |
| 0.7506944444444444 | 114.716 |
| 0.751388888888889 | 114.716 |
| 0.7520833333333333 | 110.201 |
| 0.7527777777777778 | 110.201 |
| 0.7534722222222222 | 105.69 |
| 0.7541666666666668 | 105.69 |
| 0.7548611111111111 | 101.184 |
| 0.7555555555555555 | 101.184 |
| 0.75625 | 101.184 |
| 0.7569444444444445 | 96.682 |
| 0.7576388888888889 | 96.682 |
| 0.7583333333333333 | 92.184 |
| 0.7590277777777777 | 92.184 |
| 0.7597222222222223 | 92.184 |
| 0.7604166666666666 | 87.692 |
| 0.7611111111111111 | 87.692 |
| 0.7618055555555556 | 87.692 |
| 0.7625000000000001 | 83.205 |
| 0.7631944444444444 | 83.205 |
| 0.7638888888888888 | 83.205 |
| 0.7645833333333334 | 83.205 |
| 0.7652777777777778 | 78.722 |
| 0.7659722222222222 | 78.722 |
| 0.7666666666666666 | 74.246 |
| 0.7673611111111112 | 74.246 |
| 0.7680555555555556 | 69.775 |
| 0.7687499999999999 | 69.775 |
| 0.7694444444444444 | 69.775 |
| 0.7701388888888889 | 65.31 |
| 0.7708333333333334 | 65.31 |
| 0.7715277777777777 | 65.31 |
| 0.7722222222222223 | 60.85 |
| 0.7729166666666667 | 60.85 |
| 0.7736111111111111 | 56.398 |
| 0.7743055555555555 | 56.398 |
| 0.775 | 51.951 |
| 0.7756944444444445 | 51.951 |
| 0.7763888888888889 | 47.511 |
| 0.7770833333333332 | 47.511 |
| 0.7777777777777778 | 47.511 |
| 0.7784722222222222 | 43.079 |
| 0.7791666666666667 | 43.079 |
| 0.779861111111111 | 38.653 |
| 0.7805555555555556 | 38.653 |
| 0.78125 | 38.653 |
| 0.7819444444444444 | 34.234 |
| 0.782638888888889 | 34.234 |
| 0.7833333333333333 | 29.823 |
| 0.7840277777777778 | 29.823 |
| 0.7847222222222222 | 29.823 |
| 0.7854166666666668 | 25.419 |
| 0.7861111111111111 | 25.419 |
| 0.7868055555555555 | 21.024 |
| 0.7875 | 21.024 |
| 0.7881944444444445 | 21.024 |
| 0.7888888888888889 | 21.024 |
| 0.7895833333333333 | 16.636 |
| 0.7902777777777777 | 16.636 |
| 0.7909722222222223 | 12.257 |
| 0.7916666666666666 | 12.257 |
| 0.7923611111111111 | 12.257 |
| 0.7930555555555556 | 12.257 |
| 0.7937500000000001 | 12.257 |
| 0.7944444444444444 | 7.887 |
| 0.7951388888888888 | 7.887 |
| 0.7958333333333334 | 3.525 |
| 0.7965277777777778 | 3.525 |
| 0.7972222222222222 | 3.525 |
| 0.7979166666666666 | 3.525 |
| 0.7986111111111112 | 3.525 |
| 0.7993055555555556 | 3.525 |
| 0.7999999999999999 | 3.525 |
| 0.8006944444444444 | 3.525 |
| 0.8013888888888889 | 0 |
| 0.8020833333333334 | 0 |
| 0.8027777777777777 | 0 |
| 0.8034722222222223 | 0 |
| 0.8041666666666667 | 0 |
| 0.8048611111111111 | 0 |
| 0.8055555555555555 | 0 |
| 0.80625 | 0 |
| 0.8069444444444445 | 0 |
| 0.8076388888888889 | 0 |
| 0.8083333333333332 | 0 |
| 0.8090277777777778 | 0 |
| 0.8097222222222222 | 0 |
| 0.8104166666666667 | 0 |
| 0.811111111111111 | 0 |
| 0.8118055555555556 | 0 |
| 0.8125 | 0 |
| 0.8131944444444444 | 0 |
| 0.813888888888889 | 0 |
| 0.8145833333333333 | 0 |
| 0.8152777777777778 | 0 |
| 0.8159722222222222 | 0 |
| 0.8166666666666668 | 0 |
| 0.8173611111111111 | 0 |
| 0.8180555555555555 | 0 |
| 0.81875 | 0 |
| 0.8194444444444445 | 0 |
| 0.8201388888888889 | 0 |
| 0.8208333333333333 | 0 |
| 0.8215277777777777 | 0 |
| 0.8222222222222223 | 0 |
| 0.8229166666666666 | 0 |
| 0.8236111111111111 | 0 |
| 0.8243055555555556 | 0 |
| 0.8250000000000001 | 0 |
| 0.8256944444444444 | 0 |
| 0.8263888888888888 | 0 |
| 0.8270833333333334 | 0 |
| 0.8277777777777778 | 0 |
| 0.8284722222222222 | 0 |
| 0.8291666666666666 | 0 |
| 0.8298611111111112 | 0 |
| 0.8305555555555556 | 0 |
| 0.8312499999999999 | 0 |
| 0.8319444444444444 | 0 |
| 0.8326388888888889 | 0 |
| 0.8333333333333334 | 0 |
| 0.8340277777777777 | 0 |
| 0.8347222222222223 | 0 |
| 0.8354166666666667 | 0 |
| 0.8361111111111111 | 0 |
| 0.8368055555555555 | 0 |
| 0.8375 | 0 |
| 0.8381944444444445 | 0 |
| 0.8388888888888889 | 0 |
| 0.8395833333333332 | 0 |
| 0.8402777777777778 | 0 |
| 0.8409722222222222 | 0 |
| 0.8416666666666667 | 0 |
| 0.842361111111111 | 0 |
| 0.8430555555555556 | 0 |
| 0.84375 | 0 |
| 0.8444444444444444 | 0 |
| 0.845138888888889 | 0 |
| 0.8458333333333333 | 0 |
| 0.8465277777777778 | 0 |
| 0.8472222222222222 | 0 |
| 0.8479166666666668 | 0 |
| 0.8486111111111111 | 0 |
| 0.8493055555555555 | 0 |
| 0.85 | 0 |
| 0.8506944444444445 | 0 |
| 0.8513888888888889 | 0 |
| 0.8520833333333333 | 0 |
| 0.8527777777777777 | 0 |
| 0.8534722222222223 | 0 |
| 0.8541666666666666 | 0 |
| 0.8548611111111111 | 0 |
| 0.8555555555555556 | 0 |
| 0.8562500000000001 | 0 |
| 0.8569444444444444 | 0 |
| 0.8576388888888888 | 0 |
| 0.8583333333333334 | 0 |
| 0.8590277777777778 | 0 |
| 0.8597222222222222 | 0 |
| 0.8604166666666666 | 0 |
| 0.8611111111111112 | 0 |
| 0.8618055555555556 | 0 |
| 0.8624999999999999 | 0 |
| 0.8631944444444444 | 0 |
| 0.8638888888888889 | 0 |
| 0.8645833333333334 | 0 |
| 0.8652777777777777 | 0 |
| 0.8659722222222223 | 0 |
| 0.8666666666666667 | 0 |
| 0.8673611111111111 | 0 |
| 0.8680555555555555 | 0 |
| 0.86875 | 0 |
| 0.8694444444444445 | 0 |
| 0.8701388888888889 | 0 |
| 0.8708333333333332 | 0 |
| 0.8715277777777778 | 0 |
| 0.8722222222222222 | 0 |
| 0.8729166666666667 | 0 |
| 0.873611111111111 | 0 |
| 0.8743055555555556 | 0 |
| 0.875 | 0 |
| 0.8756944444444444 | 0 |
| 0.876388888888889 | 0 |
| 0.8770833333333333 | 0 |
| 0.8777777777777778 | 0 |
| 0.8784722222222222 | 0 |
| 0.8791666666666668 | 0 |
| 0.8798611111111111 | 0 |
| 0.8805555555555555 | 0 |
| 0.88125 | 0 |
| 0.8819444444444445 | 0 |
| 0.8826388888888889 | 0 |
| 0.8833333333333333 | 0 |
| 0.8840277777777777 | 0 |
| 0.8847222222222223 | 0 |
| 0.8854166666666666 | 0 |
| 0.8861111111111111 | 0 |
| 0.8868055555555556 | 0 |
| 0.8875000000000001 | 0 |
| 0.8881944444444444 | 0 |
| 0.8888888888888888 | 0 |
| 0.8895833333333334 | 0 |
| 0.8902777777777778 | 0 |
| 0.8909722222222222 | 0 |
| 0.8916666666666666 | 0 |
| 0.8923611111111112 | 0 |
| 0.8930555555555556 | 0 |
| 0.8937499999999999 | 0 |
| 0.8944444444444444 | 0 |
| 0.8951388888888889 | 0 |
| 0.8958333333333334 | 0 |
| 0.8965277777777777 | 0 |
| 0.8972222222222223 | 0 |
| 0.8979166666666667 | 0 |
| 0.8986111111111111 | 0 |
| 0.8993055555555555 | 0 |
| 0.9 | 0 |
| 0.9006944444444445 | 0 |
| 0.9013888888888889 | 0 |
| 0.9020833333333332 | 0 |
| 0.9027777777777778 | 0 |
| 0.9034722222222222 | 0 |
| 0.9041666666666667 | 0 |
| 0.904861111111111 | 0 |
| 0.9055555555555556 | 0 |
| 0.90625 | 0 |
| 0.9069444444444444 | 0 |
| 0.907638888888889 | 0 |
| 0.9083333333333333 | 0 |
| 0.9090277777777778 | 0 |
| 0.9097222222222222 | 0 |
| 0.9104166666666668 | 0 |
| 0.9111111111111111 | 0 |
| 0.9118055555555555 | 0 |
| 0.9125 | 0 |
| 0.9131944444444445 | 0 |
| 0.9138888888888889 | 0 |
| 0.9145833333333333 | 0 |
| 0.9152777777777777 | 0 |
| 0.9159722222222223 | 0 |
| 0.9166666666666666 | 0 |
| 0.9173611111111111 | 0 |
| 0.9180555555555556 | 0 |
| 0.9187500000000001 | 0 |
| 0.9194444444444444 | 0 |
| 0.9201388888888888 | 0 |
| 0.9208333333333334 | 0 |
| 0.9215277777777778 | 0 |
| 0.9222222222222222 | 0 |
| 0.9229166666666666 | 0 |
| 0.9236111111111112 | 0 |
| 0.9243055555555556 | 0 |
| 0.9249999999999999 | 0 |
| 0.9256944444444444 | 0 |
| 0.9263888888888889 | 0 |
| 0.9270833333333334 | 0 |
| 0.9277777777777777 | 0 |
| 0.9284722222222223 | 0 |
| 0.9291666666666667 | 0 |
| 0.9298611111111111 | 0 |
| 0.9305555555555555 | 0 |
| 0.93125 | 0 |
| 0.9319444444444445 | 0 |
| 0.9326388888888889 | 0 |
| 0.9333333333333332 | 0 |
| 0.9340277777777778 | 0 |
| 0.9347222222222222 | 0 |
| 0.9354166666666667 | 0 |
| 0.936111111111111 | 0 |
| 0.9368055555555556 | 0 |
| 0.9375 | 0 |
| 0.9381944444444444 | 0 |
| 0.938888888888889 | 0 |
| 0.9395833333333333 | 0 |
| 0.9402777777777778 | 0 |
| 0.9409722222222222 | 0 |
| 0.9416666666666668 | 0 |
| 0.9423611111111111 | 0 |
| 0.9430555555555555 | 0 |
| 0.94375 | 0 |
| 0.9444444444444445 | 0 |
| 0.9451388888888889 | 0 |
| 0.9458333333333333 | 0 |
| 0.9465277777777777 | 0 |
| 0.9472222222222223 | 0 |
| 0.9479166666666666 | 0 |
| 0.9486111111111111 | 0 |
| 0.9493055555555556 | 0 |
| 0.9500000000000001 | 0 |
| 0.9506944444444444 | 0 |
| 0.9513888888888888 | 0 |
| 0.9520833333333334 | 0 |
| 0.9527777777777778 | 0 |
| 0.9534722222222222 | 0 |
| 0.9541666666666666 | 0 |
| 0.9548611111111112 | 0 |
| 0.9555555555555556 | 0 |
| 0.9562499999999999 | 0 |
| 0.9569444444444444 | 0 |
| 0.9576388888888889 | 0 |
| 0.9583333333333334 | 0 |
| 0.9590277777777777 | 0 |
| 0.9597222222222223 | 0 |
| 0.9604166666666667 | 0 |
| 0.9611111111111111 | 0 |
| 0.9618055555555555 | 0 |
| 0.9625 | 0 |
| 0.9631944444444445 | 0 |
| 0.9638888888888889 | 0 |
| 0.9645833333333332 | 0 |
| 0.9652777777777778 | 0 |
| 0.9659722222222222 | 0 |
| 0.9666666666666667 | 0 |
| 0.967361111111111 | 0 |
| 0.9680555555555556 | 0 |
| 0.96875 | 0 |
| 0.9694444444444444 | 0 |
| 0.970138888888889 | 0 |
| 0.9708333333333333 | 0 |
| 0.9715277777777778 | 0 |
| 0.9722222222222222 | 0 |
| 0.9729166666666668 | 0 |
| 0.9736111111111111 | 0 |
| 0.9743055555555555 | 0 |
| 0.975 | 0 |
| 0.9756944444444445 | 0 |
| 0.9763888888888889 | 0 |
| 0.9770833333333333 | 0 |
| 0.9777777777777777 | 0 |
| 0.9784722222222223 | 0 |
| 0.9791666666666666 | 0 |
| 0.9798611111111111 | 0 |
| 0.9805555555555556 | 0 |
| 0.9812500000000001 | 0 |
| 0.9819444444444444 | 0 |
| 0.9826388888888888 | 0 |
| 0.9833333333333334 | 0 |
| 0.9840277777777778 | 0 |
| 0.9847222222222222 | 0 |
| 0.9854166666666666 | 0 |
| 0.9861111111111112 | 0 |
| 0.9868055555555556 | 0 |
| 0.9874999999999999 | 0 |
| 0.9881944444444444 | 0 |
| 0.9888888888888889 | 0 |
| 0.9895833333333334 | 0 |
| 0.9902777777777777 | 0 |
| 0.9909722222222223 | 0 |
| 0.9916666666666667 | 0 |
| 0.9923611111111111 | 0 |
| 0.9930555555555555 | 0 |
| 0.99375 | 0 |
| 0.9944444444444445 | 0 |
| 0.9951388888888889 | 0 |
| 0.9958333333333332 | 0 |
| 0.9965277777777778 | 0 |
| 0.9972222222222222 | 0 |
| 0.9979166666666667 | 0 |
| 0.998611111111111 | 0 |
| 0.9993055555555556 | 0 |